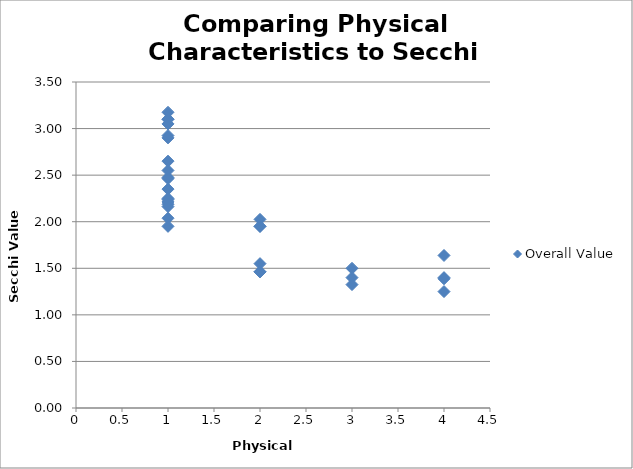
| Category | Overall Value |
|---|---|
| 4.0 | 1.25 |
| 3.0 | 1.325 |
| 4.0 | 1.388 |
| 3.0 | 1.4 |
| 4.0 | 1.4 |
| 2.0 | 1.462 |
| 2.0 | 1.462 |
| 3.0 | 1.5 |
| 2.0 | 1.55 |
| 4.0 | 1.638 |
| 2.0 | 1.95 |
| 1.0 | 1.95 |
| 2.0 | 1.95 |
| 2.0 | 2.025 |
| 1.0 | 2.038 |
| 1.0 | 2.162 |
| 1.0 | 2.188 |
| 1.0 | 2.212 |
| 1.0 | 2.238 |
| 1.0 | 2.25 |
| 1.0 | 2.35 |
| 1.0 | 2.463 |
| 1.0 | 2.475 |
| 1.0 | 2.55 |
| 1.0 | 2.65 |
| 1.0 | 2.9 |
| 1.0 | 2.925 |
| 1.0 | 3.05 |
| 1.0 | 3.1 |
| 1.0 | 3.1 |
| 1.0 | 3.175 |